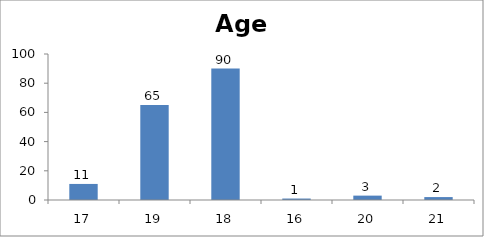
| Category | Age |
|---|---|
| 17.0 | 11 |
| 19.0 | 65 |
| 18.0 | 90 |
| 16.0 | 1 |
| 20.0 | 3 |
| 21.0 | 2 |